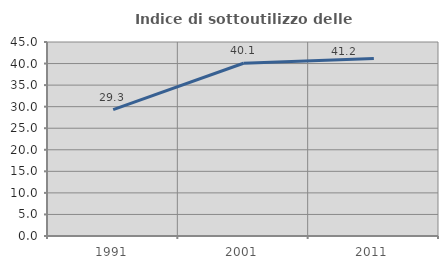
| Category | Indice di sottoutilizzo delle abitazioni  |
|---|---|
| 1991.0 | 29.327 |
| 2001.0 | 40.07 |
| 2011.0 | 41.166 |